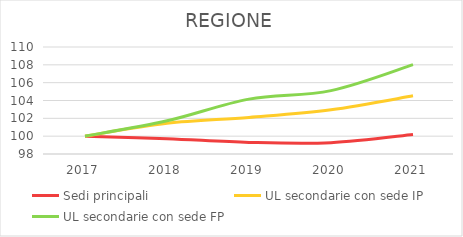
| Category | Sedi principali | UL secondarie con sede IP | UL secondarie con sede FP |
|---|---|---|---|
| 2017.0 | 100 | 100 | 100 |
| 2018.0 | 99.722 | 101.44 | 101.726 |
| 2019.0 | 99.303 | 102.106 | 104.153 |
| 2020.0 | 99.271 | 102.961 | 105.108 |
| 2021.0 | 100.181 | 104.523 | 108.018 |